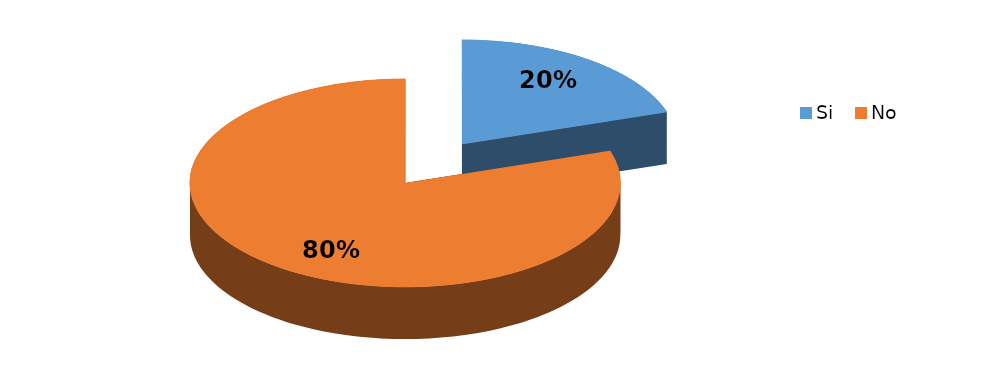
| Category | Frecuencia |
|---|---|
| Si | 1 |
| No | 4 |